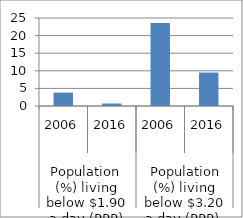
| Category | Series 0 |
|---|---|
| 0 | 3.8 |
| 1 | 0.7 |
| 2 | 23.6 |
| 3 | 9.5 |